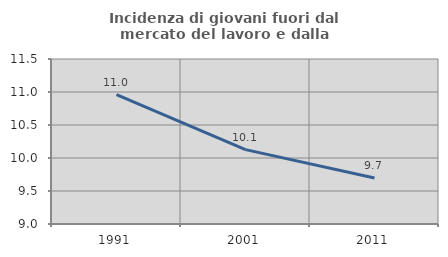
| Category | Incidenza di giovani fuori dal mercato del lavoro e dalla formazione  |
|---|---|
| 1991.0 | 10.961 |
| 2001.0 | 10.127 |
| 2011.0 | 9.698 |